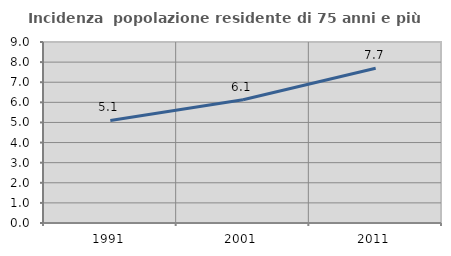
| Category | Incidenza  popolazione residente di 75 anni e più |
|---|---|
| 1991.0 | 5.1 |
| 2001.0 | 6.128 |
| 2011.0 | 7.696 |